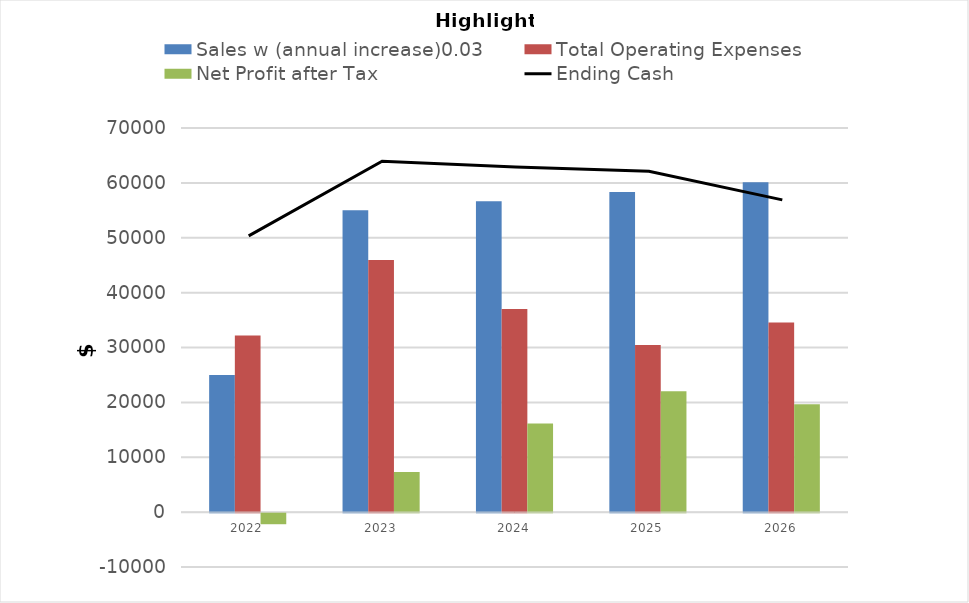
| Category | Sales w (annual increase)0.03 | Total Operating Expenses | Net Profit after Tax |
|---|---|---|---|
| 2022.0 | 25000 | 32184.821 | -2022.916 |
| 2023.0 | 55000 | 45925.241 | 7329.702 |
| 2024.0 | 56650 | 37002.299 | 16135.332 |
| 2025.0 | 58349.5 | 30444.953 | 22040.947 |
| 2026.0 | 60099.985 | 34558.385 | 19651.804 |